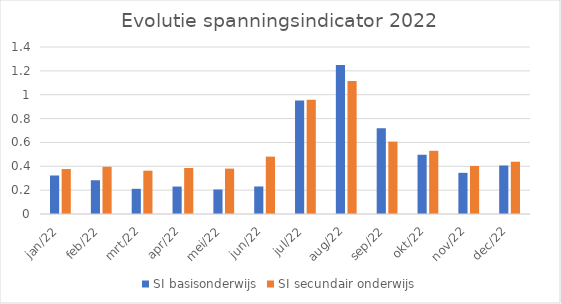
| Category | SI basisonderwijs | SI secundair onderwijs |
|---|---|---|
| jan/22 | 0.323 | 0.377 |
| feb/22 | 0.283 | 0.396 |
| mrt/22 | 0.211 | 0.363 |
| apr/22 | 0.23 | 0.385 |
| mei/22 | 0.206 | 0.38 |
| jun/22 | 0.231 | 0.481 |
| jul/22 | 0.952 | 0.959 |
| aug/22 | 1.249 | 1.115 |
| sep/22 | 0.719 | 0.607 |
| okt/22 | 0.497 | 0.53 |
| nov/22 | 0.345 | 0.403 |
| dec/22 | 0.407 | 0.438 |